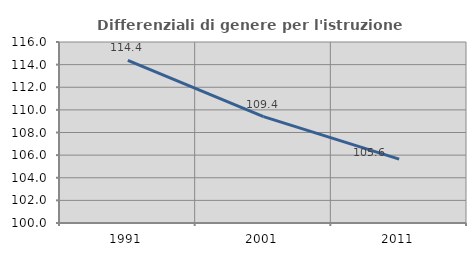
| Category | Differenziali di genere per l'istruzione superiore |
|---|---|
| 1991.0 | 114.37 |
| 2001.0 | 109.402 |
| 2011.0 | 105.646 |